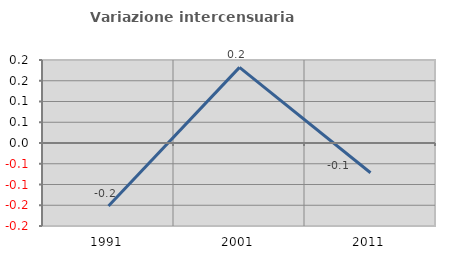
| Category | Variazione intercensuaria annua |
|---|---|
| 1991.0 | -0.152 |
| 2001.0 | 0.182 |
| 2011.0 | -0.072 |